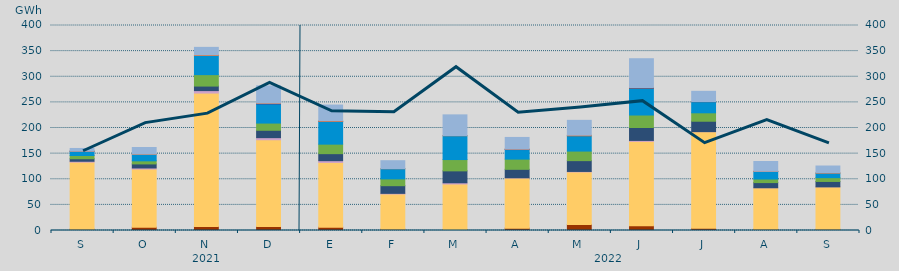
| Category | Carbón | Ciclo Combinado | Cogeneración | Consumo Bombeo | Eólica | Hidráulica | Nuclear | Solar fotovoltaica | Solar térmica | Turbinación bombeo |
|---|---|---|---|---|---|---|---|---|---|---|
| S | 2513.5 | 130905.6 | 1691.3 | 4917 | 6277.1 | 8332.4 | 87 | 26 | 0 | 5316.1 |
| O | 6371.9 | 113565.2 | 2101.6 | 7861 | 6030.7 | 12656.8 | 0 | 469.9 | 0 | 12892.5 |
| N | 7794.3 | 260394.8 | 4761.9 | 8865.5 | 22305.4 | 37370.7 | 0 | 1030.6 | 0 | 14816.5 |
| D | 7972.1 | 169088.6 | 4082.4 | 14411.7 | 14056.2 | 37289.7 | 1050 | 631.2 | 0 | 33677.5 |
| E | 6570.2 | 126286.6 | 3356.8 | 13716.6 | 18556.1 | 44421.9 | 42 | 928.6 | 0 | 30908.5 |
| F | 2568.1 | 68716.7 | 1177.2 | 14975 | 13257.2 | 19925.5 | 0 | 116 | 0 | 15456.1 |
| M | 1920.2 | 88833.3 | 2368.3 | 23235.2 | 22069.1 | 46579.6 | 0 | 131 | 0 | 40486 |
| A | 4593.5 | 97889.1 | 405.8 | 16475.5 | 19937.3 | 18601.3 | 663.3 | 233.1 | 0 | 22786.5 |
| M | 11875.65 | 102430.975 | 928.85 | 21079.775 | 18647.725 | 29842.925 | 0 | 1098.75 | 0 | 29000.65 |
| J | 9138.825 | 164797.65 | 1808.4 | 25204.95 | 24371.3 | 52553.275 | 599.625 | 596 | 0 | 56106.775 |
| J | 4302 | 188455.5 | 190.325 | 20249.475 | 16437.65 | 21832.925 | 50 | 230.625 | 0 | 19818.55 |
| A | 2452.3 | 80908.85 | 69.8 | 10038.425 | 6983.45 | 14747.025 | 33 | 300.1 | 0 | 19076.4 |
| S | 2236 | 82926.675 | 23 | 10509.975 | 7386.425 | 8900.725 | 0 | 476.125 | 0 | 13369.775 |